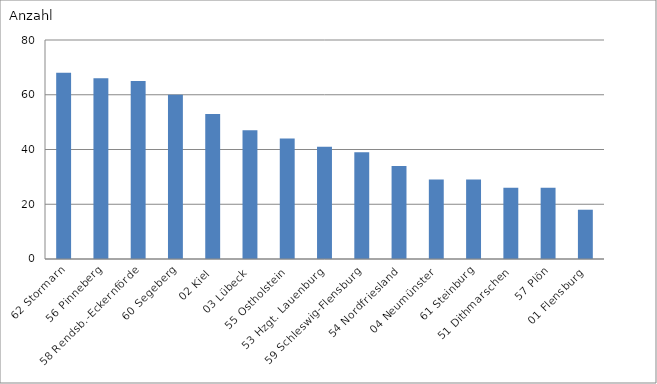
| Category | 62 Stormarn |
|---|---|
| 62 Stormarn | 68 |
| 56 Pinneberg | 66 |
| 58 Rendsb.-Eckernförde | 65 |
| 60 Segeberg | 60 |
| 02 Kiel | 53 |
| 03 Lübeck | 47 |
| 55 Ostholstein | 44 |
| 53 Hzgt. Lauenburg | 41 |
| 59 Schleswig-Flensburg | 39 |
| 54 Nordfriesland | 34 |
| 04 Neumünster | 29 |
| 61 Steinburg | 29 |
| 51 Dithmarschen | 26 |
| 57 Plön | 26 |
| 01 Flensburg | 18 |